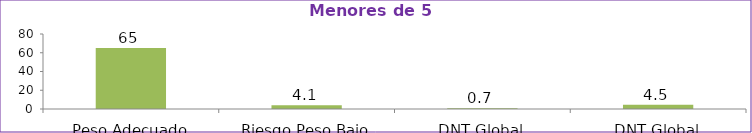
| Category | Series 0 |
|---|---|
| Peso Adecuado | 65 |
| Riesgo Peso Bajo | 4.1 |
| DNT Global | 0.7 |
| DNT Global | 4.5 |